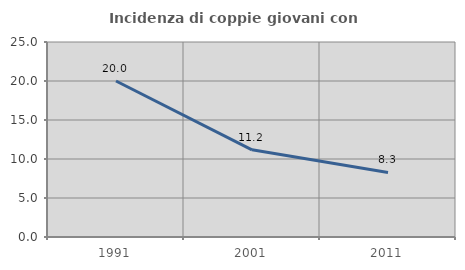
| Category | Incidenza di coppie giovani con figli |
|---|---|
| 1991.0 | 20 |
| 2001.0 | 11.178 |
| 2011.0 | 8.282 |